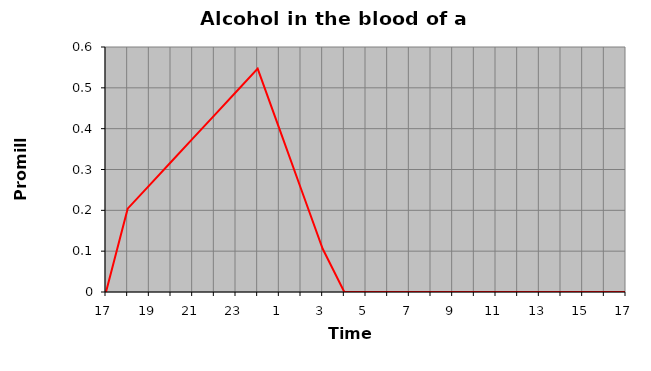
| Category | Series 0 |
|---|---|
| 17.0 | 0 |
| 18.0 | 0.204 |
| 19.0 | 0.261 |
| 20.0 | 0.318 |
| 21.0 | 0.376 |
| 22.0 | 0.433 |
| 23.0 | 0.49 |
| 0.0 | 0.547 |
| 1.0 | 0.4 |
| 2.0 | 0.253 |
| 3.0 | 0.106 |
| 4.0 | 0 |
| 5.0 | 0 |
| 6.0 | 0 |
| 7.0 | 0 |
| 8.0 | 0 |
| 9.0 | 0 |
| 10.0 | 0 |
| 11.0 | 0 |
| 12.0 | 0 |
| 13.0 | 0 |
| 14.0 | 0 |
| 15.0 | 0 |
| 16.0 | 0 |
| 17.0 | 0 |